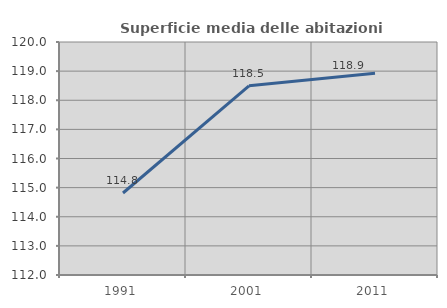
| Category | Superficie media delle abitazioni occupate |
|---|---|
| 1991.0 | 114.816 |
| 2001.0 | 118.495 |
| 2011.0 | 118.928 |